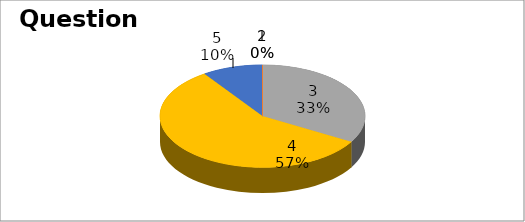
| Category | Series 0 |
|---|---|
| 0 | 0 |
| 1 | 0 |
| 2 | 7 |
| 3 | 12 |
| 4 | 2 |